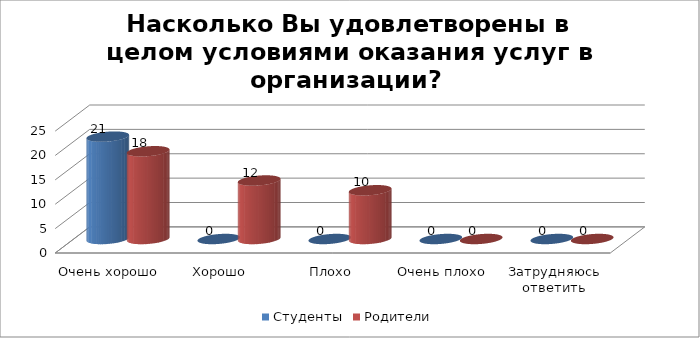
| Category | Студенты | Родители |
|---|---|---|
| Очень хорошо | 21 | 18 |
| Хорошо | 0 | 12 |
| Плохо | 0 | 10 |
| Очень плохо | 0 | 0 |
| Затрудняюсь ответить | 0 | 0 |